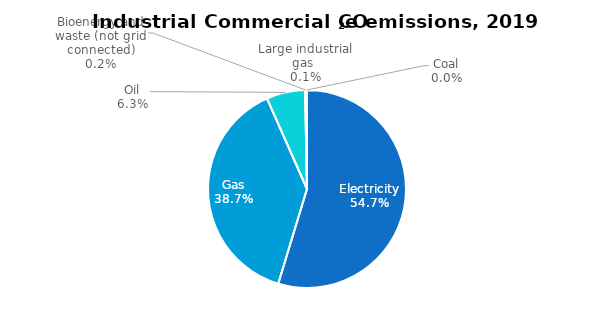
| Category | Series 0 |
|---|---|
| Electricity | 5.137 |
| Gas | 3.632 |
| Oil | 0.594 |
| Bioenergy and waste (not grid connected) | 0.014 |
| Large industrial gas  | 0.011 |
| Coal | 0.004 |